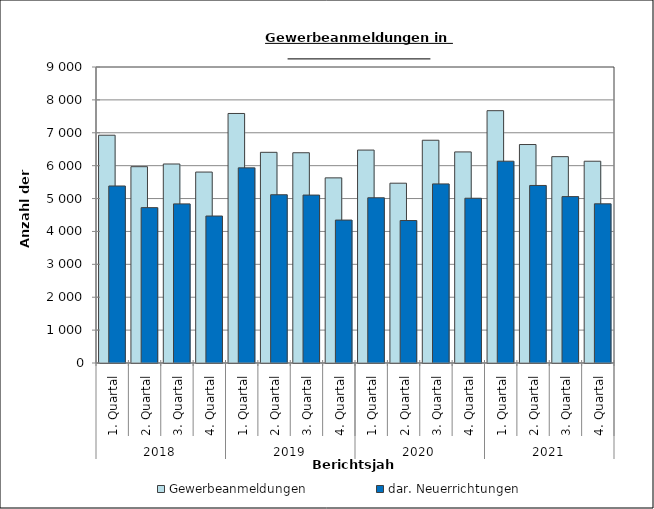
| Category | Gewerbeanmeldungen | dar. Neuerrichtungen |
|---|---|---|
| 0 | 6926 | 5382 |
| 1 | 5969 | 4724 |
| 2 | 6051 | 4838 |
| 3 | 5806 | 4469 |
| 4 | 7587 | 5933 |
| 5 | 6406 | 5116 |
| 6 | 6393 | 5106 |
| 7 | 5629 | 4346 |
| 8 | 6474 | 5024 |
| 9 | 5467 | 4332 |
| 10 | 6773 | 5445 |
| 11 | 6418 | 5010 |
| 12 | 7672 | 6136 |
| 13 | 6643 | 5398 |
| 14 | 6274 | 5059 |
| 15 | 6135 | 4840 |